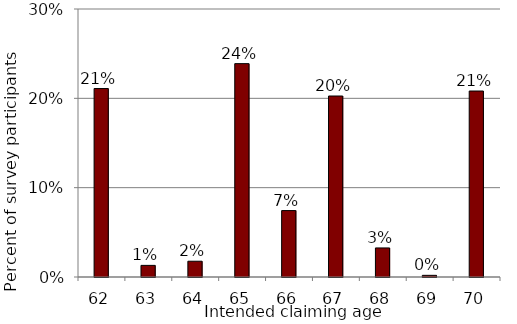
| Category | Series 0 |
|---|---|
| 62.0 | 0.211 |
| 63.0 | 0.013 |
| 64.0 | 0.018 |
| 65.0 | 0.239 |
| 66.0 | 0.074 |
| 67.0 | 0.203 |
| 68.0 | 0.033 |
| 69.0 | 0.002 |
| 70.0 | 0.208 |